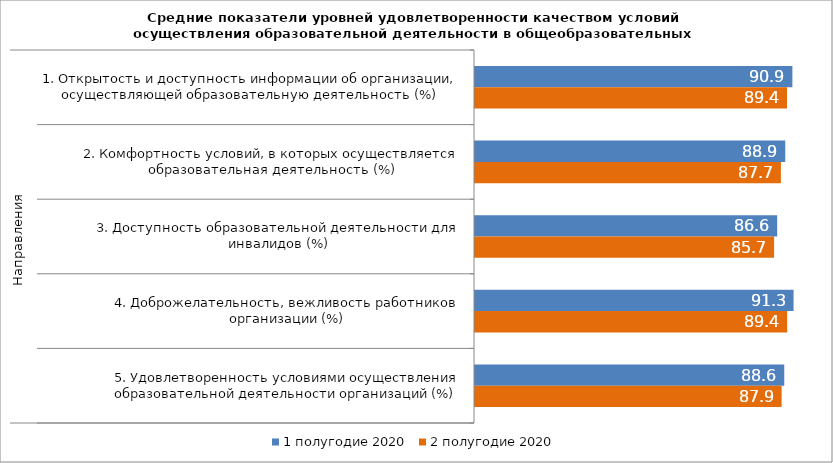
| Category | 1 полугодие 2020 | 2 полугодие 2020 |
|---|---|---|
| 0 | 90.942 | 89.399 |
| 1 | 88.893 | 87.652 |
| 2 | 86.586 | 85.698 |
| 3 | 91.278 | 89.443 |
| 4 | 88.616 | 87.86 |